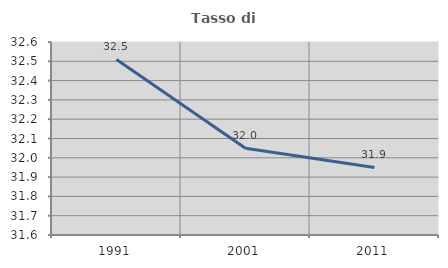
| Category | Tasso di occupazione   |
|---|---|
| 1991.0 | 32.51 |
| 2001.0 | 32.05 |
| 2011.0 | 31.95 |